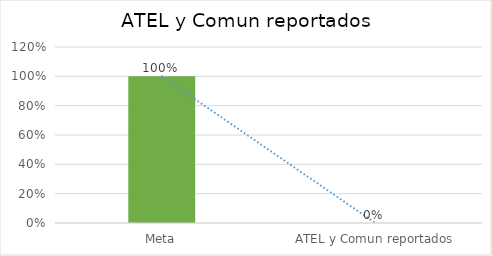
| Category | Series 0 |
|---|---|
| Meta | 1 |
| ATEL y Comun reportados | 0 |